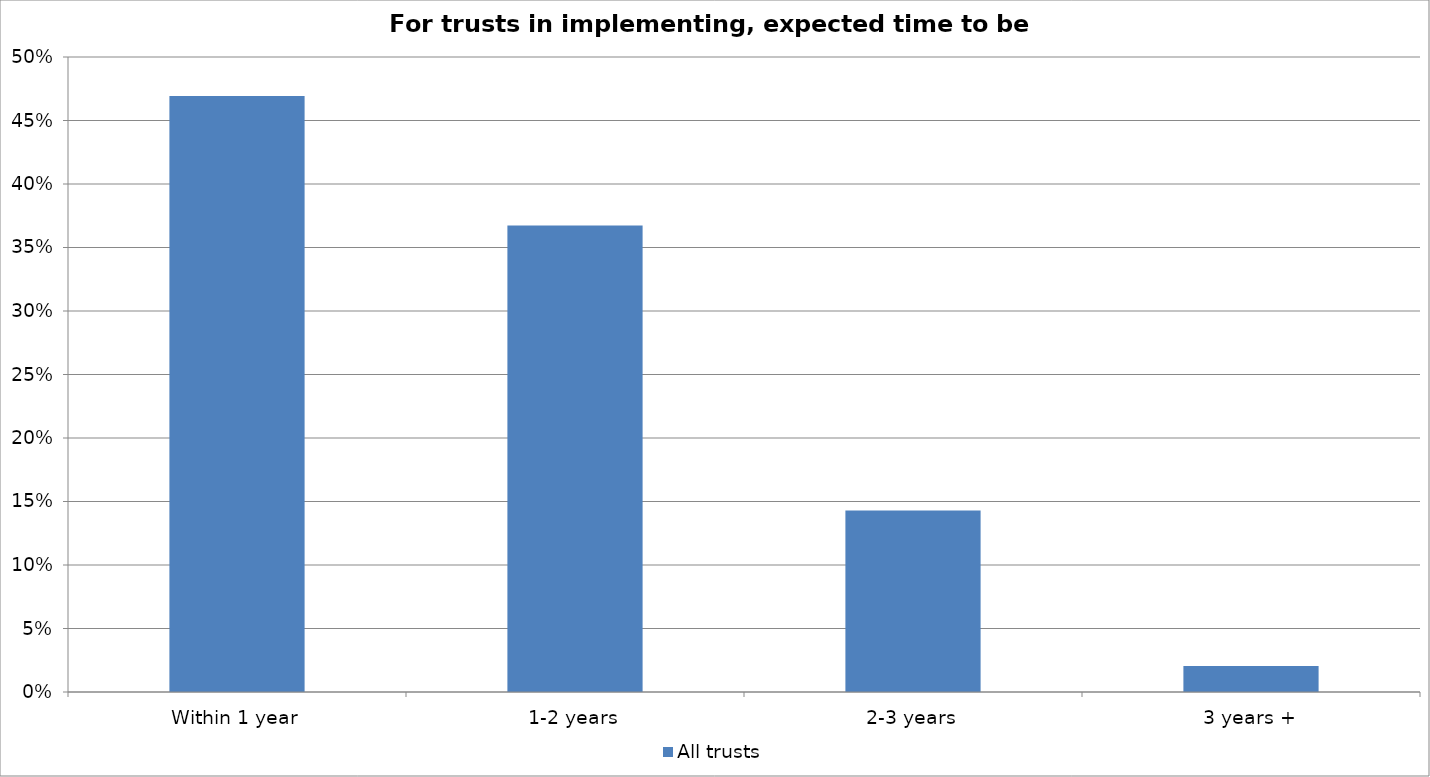
| Category | All trusts |
|---|---|
| Within 1 year | 0.469 |
| 1-2 years | 0.367 |
| 2-3 years | 0.143 |
| 3 years + | 0.02 |